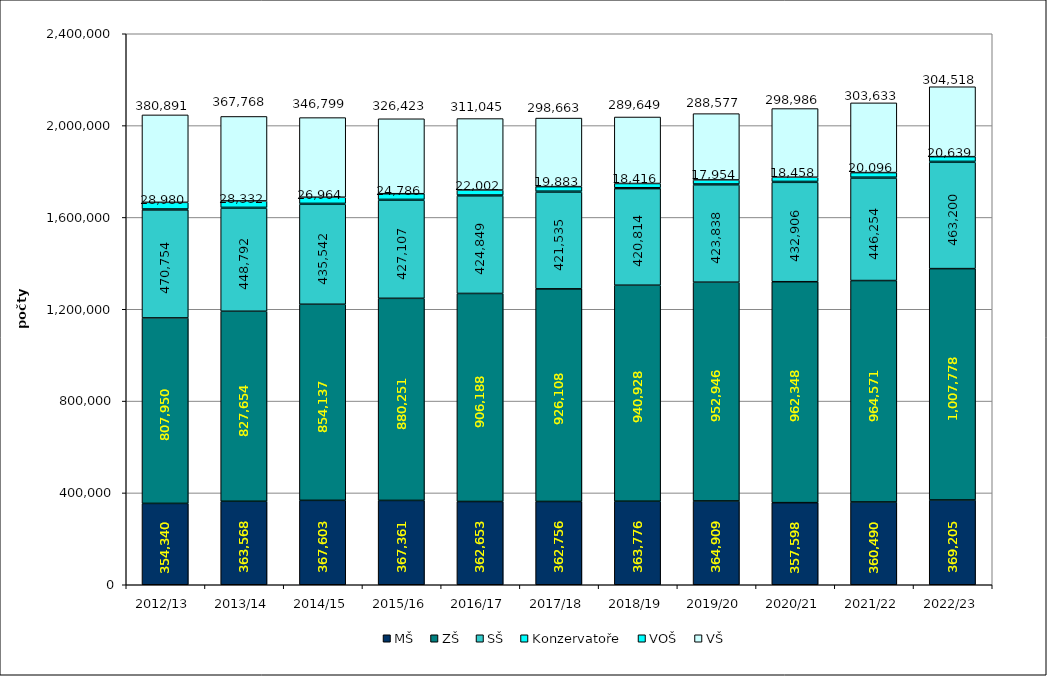
| Category | MŠ | ZŠ | SŠ | Konzervatoře | VOŠ | VŠ |
|---|---|---|---|---|---|---|
| 2012/13 | 354340 | 807950 | 470754 | 3655 | 28980 | 380891 |
| 2013/14 | 363568 | 827654 | 448792 | 3690 | 28332 | 367768 |
| 2014/15 | 367603 | 854137 | 435542 | 3752 | 26964 | 346799 |
| 2015/16 | 367361 | 880251 | 427107 | 3733 | 24786 | 326423 |
| 2016/17 | 362653 | 906188 | 424849 | 3795 | 22002 | 311045 |
| 2017/18 | 362756 | 926108 | 421535 | 3781 | 19883 | 298663 |
| 2018/19 | 363776 | 940928 | 420814 | 3813 | 18416 | 289649 |
| 2019/20 | 364909 | 952946 | 423838 | 3836 | 17954 | 288577 |
| 2020/21 | 357598 | 962348 | 432906 | 3902 | 18458 | 298986 |
| 2021/22 | 360490 | 964571 | 446254 | 3880 | 20096 | 303633 |
| 2022/23 | 369205 | 1007778 | 463200 | 3837 | 20639 | 304518 |